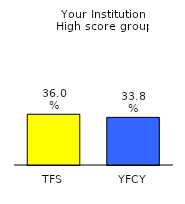
| Category | Series 0 |
|---|---|
| TFS | 0.36 |
| YFCY | 0.338 |